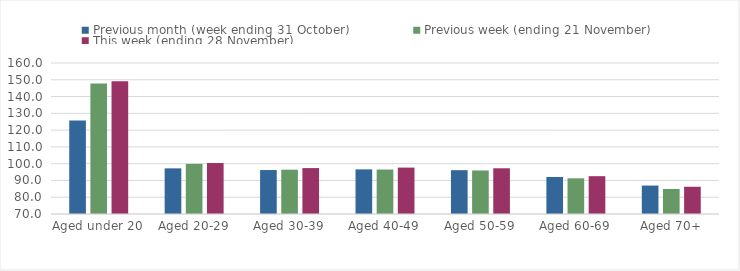
| Category | Previous month (week ending 31 October) | Previous week (ending 21 November) | This week (ending 28 November) |
|---|---|---|---|
| Aged under 20 | 125.8 | 147.72 | 149.16 |
| Aged 20-29 | 97.2 | 99.88 | 100.38 |
| Aged 30-39 | 96.2 | 96.41 | 97.37 |
| Aged 40-49 | 96.6 | 96.5 | 97.66 |
| Aged 50-59 | 96.12 | 95.95 | 97.25 |
| Aged 60-69 | 92.07 | 91.28 | 92.55 |
| Aged 70+ | 86.95 | 84.92 | 86.24 |